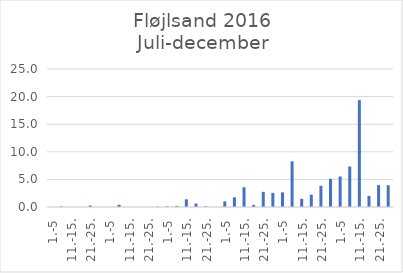
| Category | Series 0 |
|---|---|
| 1.-5 | 0 |
| 6.-10. | 0.116 |
| 11.-15. | 0 |
| 16.-20. | 0 |
| 21.-25. | 0.265 |
| 26.-31. | 0 |
| 1.-5 | 0 |
| 6.-10. | 0.404 |
| 11.-15. | 0 |
| 16.-20. | 0 |
| 21.-25. | 0 |
| 26.-31. | 0.074 |
| 1.-5 | 0.128 |
| 6.-10. | 0.209 |
| 11.-15. | 1.391 |
| 16.-20. | 0.616 |
| 21.-25. | 0.128 |
| 26.-30. | 0 |
| 1.-5 | 1.028 |
| 6.-10. | 1.759 |
| 11.-15. | 3.576 |
| 16.-20. | 0.364 |
| 21.-25. | 2.745 |
| 26.-31. | 2.554 |
| 1.-5 | 2.651 |
| 6.-10. | 8.263 |
| 11.-15. | 1.475 |
| 16.-20. | 2.225 |
| 21.-25. | 3.841 |
| 26.-30. | 5.106 |
| 1.-5 | 5.53 |
| 6.-10. | 7.333 |
| 11.-15. | 19.363 |
| 16.-20. | 2.011 |
| 21.-25. | 3.967 |
| 26.-31. | 3.953 |